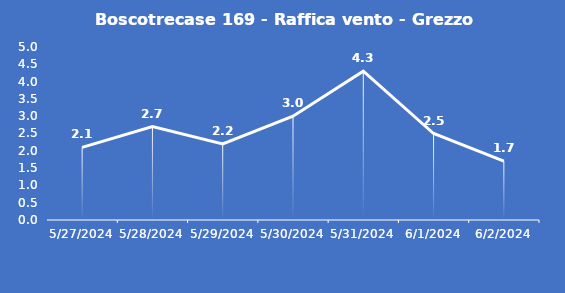
| Category | Boscotrecase 169 - Raffica vento - Grezzo (m/s) |
|---|---|
| 5/27/24 | 2.1 |
| 5/28/24 | 2.7 |
| 5/29/24 | 2.2 |
| 5/30/24 | 3 |
| 5/31/24 | 4.3 |
| 6/1/24 | 2.5 |
| 6/2/24 | 1.7 |